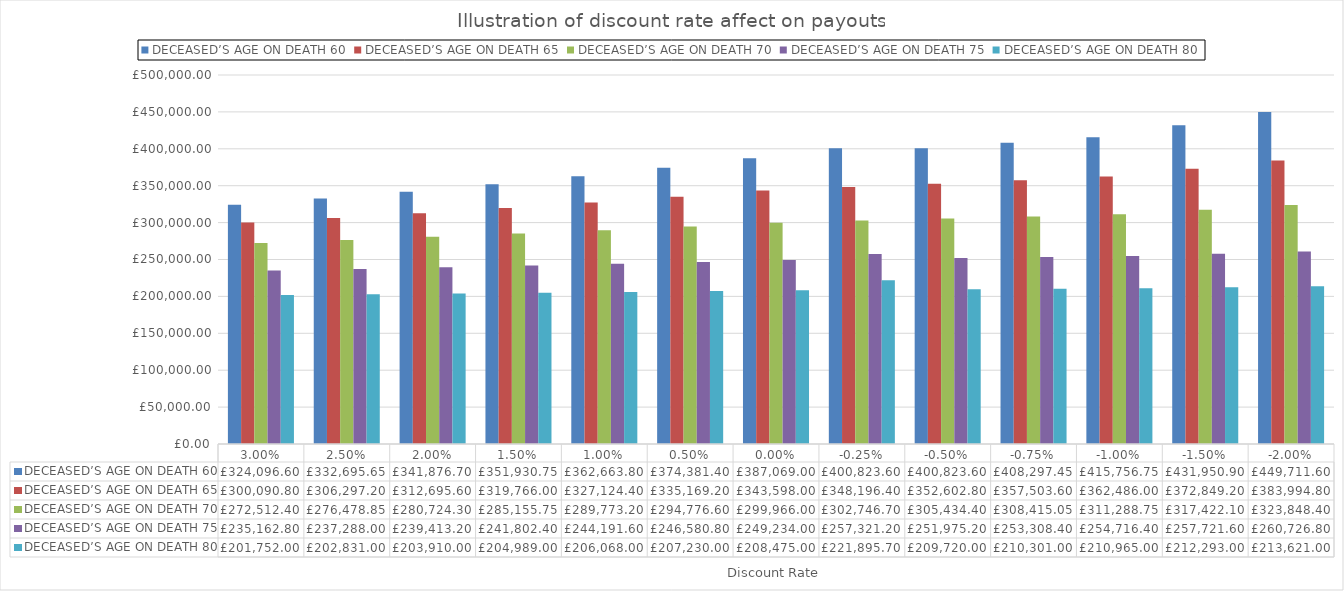
| Category | DECEASED’S AGE ON DEATH |
|---|---|
| 0.03 | 201752 |
| 0.025 | 202831 |
| 0.02 | 203910 |
| 0.015 | 204989 |
| 0.01 | 206068 |
| 0.005 | 207230 |
| 0.0 | 208475 |
| -0.0025 | 221895.7 |
| -0.005 | 209720 |
| -0.0075 | 210301 |
| -0.01 | 210965 |
| -0.015 | 212293 |
| -0.02 | 213621 |